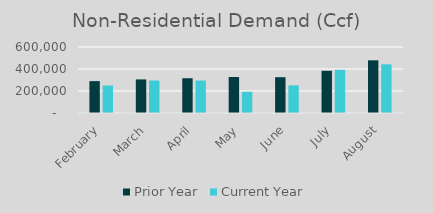
| Category | Prior Year | Current Year |
|---|---|---|
| February | 289857 | 249807 |
| March | 305426 | 295423 |
| April | 315985 | 295012.49 |
| May | 327135 | 192797 |
| June | 325420 | 250692.26 |
| July | 383814 | 392092.25 |
| August | 478930 | 442683.78 |